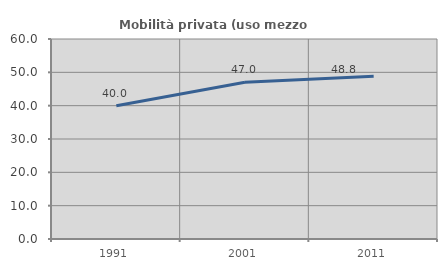
| Category | Mobilità privata (uso mezzo privato) |
|---|---|
| 1991.0 | 39.974 |
| 2001.0 | 47.045 |
| 2011.0 | 48.845 |